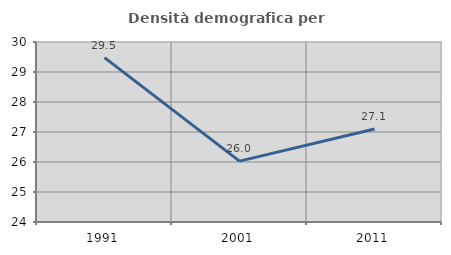
| Category | Densità demografica |
|---|---|
| 1991.0 | 29.478 |
| 2001.0 | 26.03 |
| 2011.0 | 27.098 |